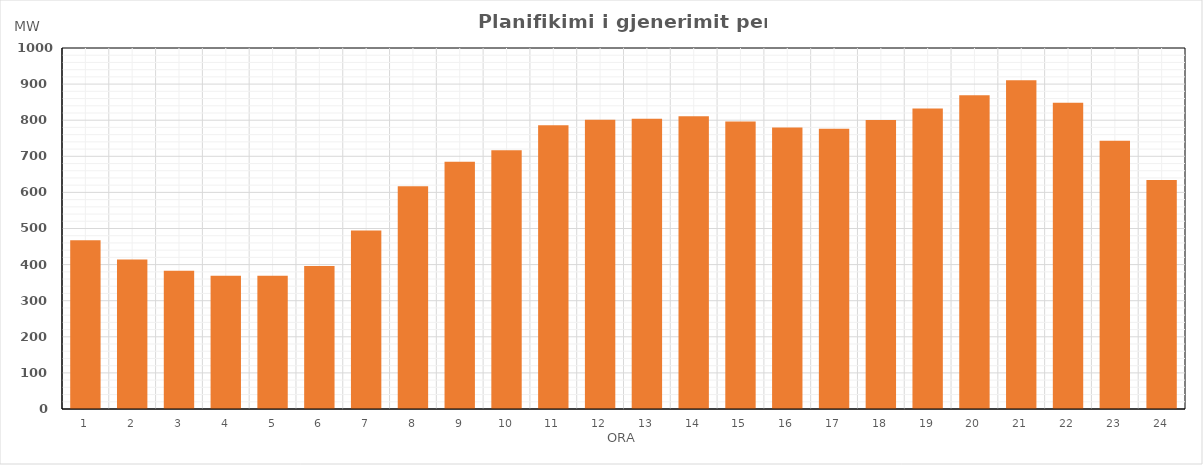
| Category | Max (MW) |
|---|---|
| 0 | 467.7 |
| 1 | 414 |
| 2 | 382.91 |
| 3 | 368.89 |
| 4 | 369.28 |
| 5 | 396.27 |
| 6 | 494.46 |
| 7 | 616.7 |
| 8 | 684.71 |
| 9 | 717.1 |
| 10 | 785.92 |
| 11 | 801.1 |
| 12 | 804.01 |
| 13 | 810.61 |
| 14 | 796.2 |
| 15 | 779.48 |
| 16 | 776.09 |
| 17 | 800.88 |
| 18 | 832.38 |
| 19 | 868.9 |
| 20 | 910.57 |
| 21 | 848.56 |
| 22 | 742.77 |
| 23 | 634.18 |